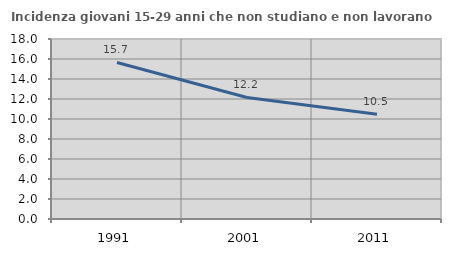
| Category | Incidenza giovani 15-29 anni che non studiano e non lavorano  |
|---|---|
| 1991.0 | 15.652 |
| 2001.0 | 12.151 |
| 2011.0 | 10.468 |